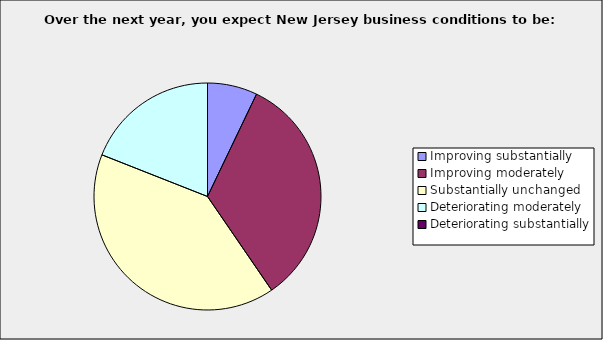
| Category | Series 0 |
|---|---|
| Improving substantially | 0.071 |
| Improving moderately | 0.333 |
| Substantially unchanged | 0.405 |
| Deteriorating moderately | 0.19 |
| Deteriorating substantially | 0 |